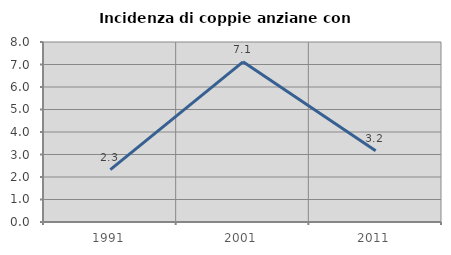
| Category | Incidenza di coppie anziane con figli |
|---|---|
| 1991.0 | 2.326 |
| 2001.0 | 7.117 |
| 2011.0 | 3.17 |